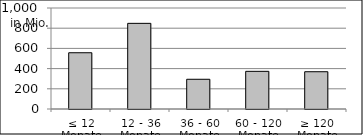
| Category | Volumen |
|---|---|
| ≤ 12 Monate | 557035678.17 |
| 12 - 36 Monate | 848014296.8 |
| 36 - 60 Monate | 294399401.61 |
| 60 - 120 Monate | 372841780.457 |
| ≥ 120 Monate | 369080770.824 |